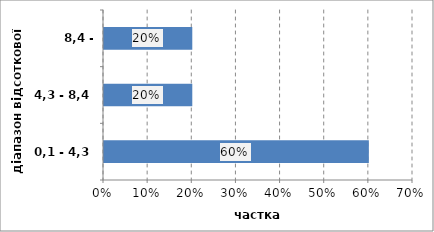
| Category | Series 0 |
|---|---|
| 0,1 - 4,3 | 0.6 |
| 4,3 - 8,4 | 0.2 |
| 8,4 - 12,6 | 0.2 |